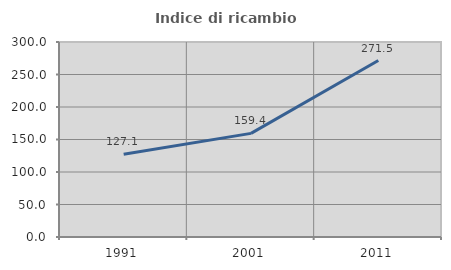
| Category | Indice di ricambio occupazionale  |
|---|---|
| 1991.0 | 127.149 |
| 2001.0 | 159.444 |
| 2011.0 | 271.519 |